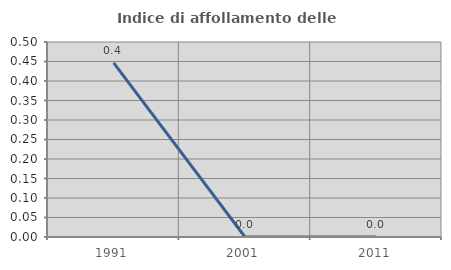
| Category | Indice di affollamento delle abitazioni  |
|---|---|
| 1991.0 | 0.446 |
| 2001.0 | 0 |
| 2011.0 | 0 |